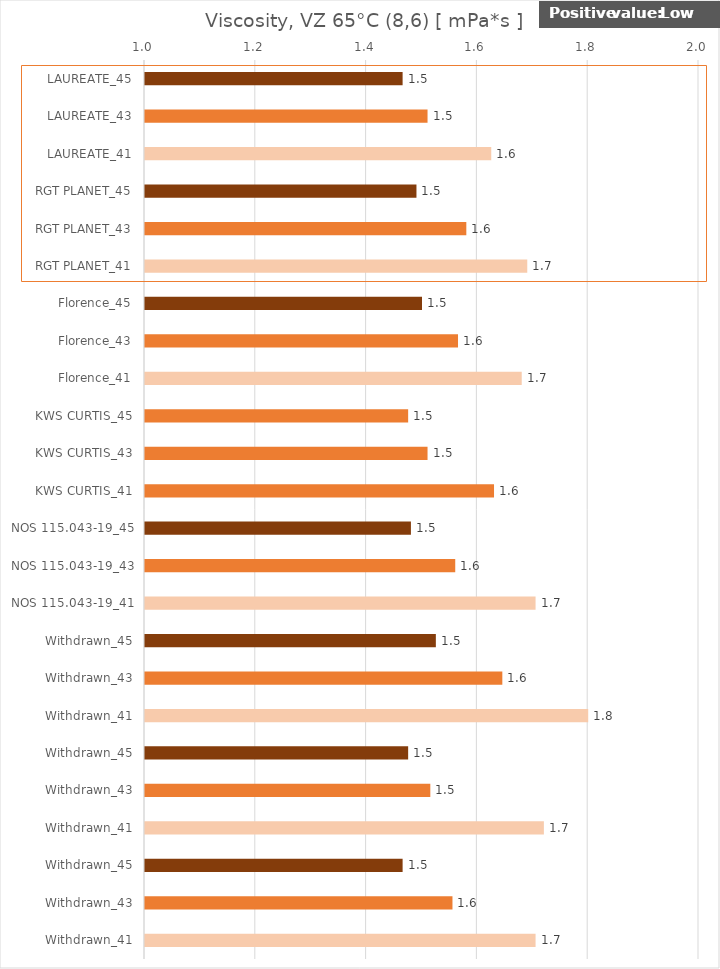
| Category |   Viscosity  VZ 65°C (8,6) [ mPa*s ] |
|---|---|
| LAUREATE_45 | 1.465 |
| LAUREATE_43 | 1.51 |
| LAUREATE_41 | 1.625 |
| RGT PLANET_45 | 1.49 |
| RGT PLANET_43 | 1.58 |
| RGT PLANET_41 | 1.69 |
| Florence_45 | 1.5 |
| Florence_43 | 1.565 |
| Florence_41 | 1.68 |
| KWS CURTIS_45 | 1.475 |
| KWS CURTIS_43 | 1.51 |
| KWS CURTIS_41 | 1.63 |
| NOS 115.043-19_45 | 1.48 |
| NOS 115.043-19_43 | 1.56 |
| NOS 115.043-19_41 | 1.705 |
| Withdrawn_45 | 1.525 |
| Withdrawn_43 | 1.645 |
| Withdrawn_41 | 1.8 |
| Withdrawn_45 | 1.475 |
| Withdrawn_43 | 1.515 |
| Withdrawn_41 | 1.72 |
| Withdrawn_45 | 1.465 |
| Withdrawn_43 | 1.555 |
| Withdrawn_41 | 1.705 |